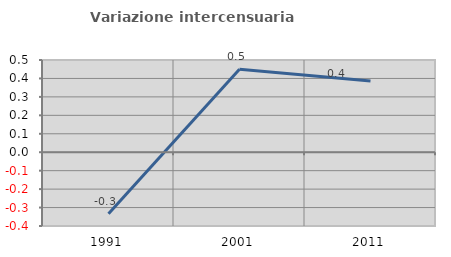
| Category | Variazione intercensuaria annua |
|---|---|
| 1991.0 | -0.333 |
| 2001.0 | 0.45 |
| 2011.0 | 0.387 |